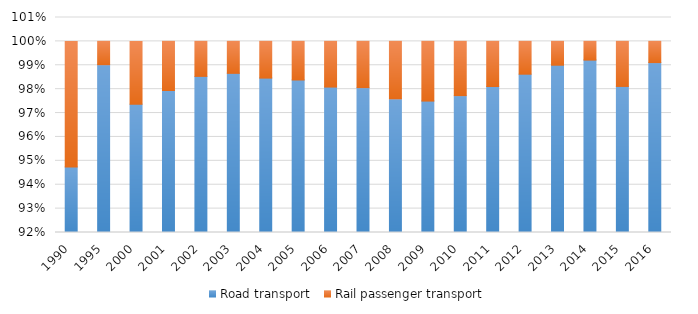
| Category | Road transport  | Rail passenger transport |
|---|---|---|
| 1990.0 | 0.947 | 0.053 |
| 1995.0 | 0.99 | 0.01 |
| 2000.0 | 0.974 | 0.026 |
| 2001.0 | 0.979 | 0.021 |
| 2002.0 | 0.985 | 0.015 |
| 2003.0 | 0.987 | 0.013 |
| 2004.0 | 0.985 | 0.015 |
| 2005.0 | 0.984 | 0.016 |
| 2006.0 | 0.981 | 0.019 |
| 2007.0 | 0.981 | 0.019 |
| 2008.0 | 0.976 | 0.024 |
| 2009.0 | 0.975 | 0.025 |
| 2010.0 | 0.977 | 0.023 |
| 2011.0 | 0.981 | 0.019 |
| 2012.0 | 0.986 | 0.014 |
| 2013.0 | 0.99 | 0.01 |
| 2014.0 | 0.992 | 0.008 |
| 2015.0 | 0.981 | 0.019 |
| 2016.0 | 0.991 | 0.009 |